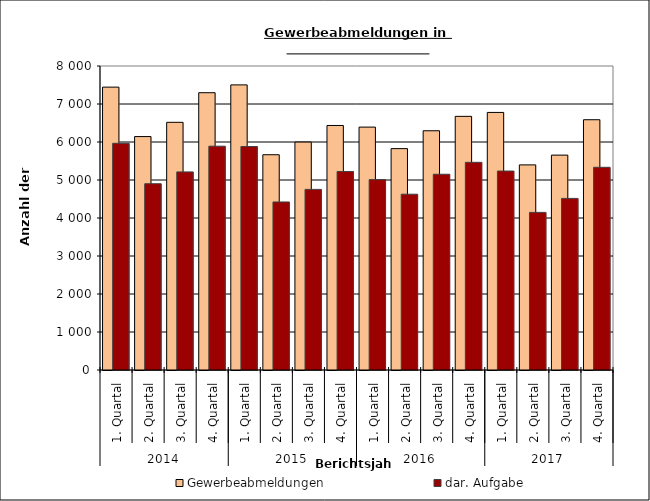
| Category | Gewerbeabmeldungen | dar. Aufgabe |
|---|---|---|
| 0 | 7444 | 5966 |
| 1 | 6143 | 4902 |
| 2 | 6518 | 5213 |
| 3 | 7297 | 5890 |
| 4 | 7503 | 5881 |
| 5 | 5665 | 4422 |
| 6 | 5998 | 4753 |
| 7 | 6435 | 5224 |
| 8 | 6392 | 5010 |
| 9 | 5826 | 4626 |
| 10 | 6296 | 5151 |
| 11 | 6675 | 5465 |
| 12 | 6778 | 5236 |
| 13 | 5398 | 4148 |
| 14 | 5655 | 4516 |
| 15 | 6586 | 5334 |